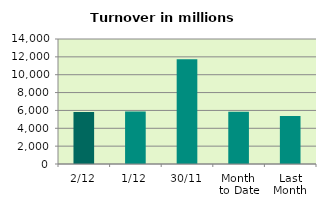
| Category | Series 0 |
|---|---|
| 2/12 | 5827.512 |
| 1/12 | 5875.461 |
| 30/11 | 11720.407 |
| Month 
to Date | 5851.486 |
| Last
Month | 5362.851 |